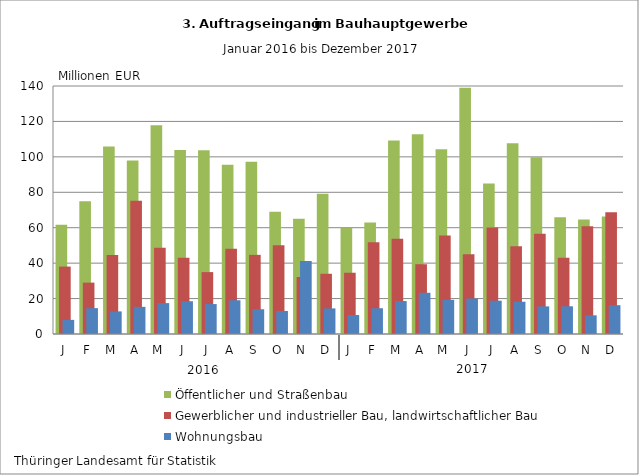
| Category | Öffentlicher und Straßenbau | Gewerblicher und industrieller Bau, landwirtschaftlicher Bau | Wohnungsbau |
|---|---|---|---|
| J | 61.631 | 38.06 | 7.976 |
| F | 74.906 | 28.999 | 14.592 |
| M | 105.833 | 44.661 | 12.76 |
| A | 97.886 | 75.266 | 15.338 |
| M | 117.816 | 48.749 | 17.447 |
| J | 103.834 | 43.034 | 18.502 |
| J | 103.782 | 34.945 | 16.902 |
| A | 95.572 | 48.126 | 19.05 |
| S | 97.229 | 44.678 | 13.973 |
| O | 69.064 | 50.067 | 12.978 |
| N | 65.047 | 32.174 | 41.204 |
| D | 79.228 | 34.003 | 14.448 |
| J | 59.936 | 34.583 | 10.705 |
| F | 63.002 | 51.757 | 14.543 |
| M | 109.239 | 53.766 | 18.6 |
| A | 112.736 | 39.392 | 23.265 |
| M | 104.313 | 55.659 | 19.293 |
| J | 139.021 | 45.061 | 20.034 |
| J | 84.891 | 60.091 | 18.805 |
| A | 107.704 | 49.474 | 18.212 |
| S | 99.774 | 56.629 | 15.589 |
| O | 65.936 | 42.996 | 15.655 |
| N | 64.63 | 60.777 | 10.54 |
| D | 66.359 | 68.754 | 16.267 |